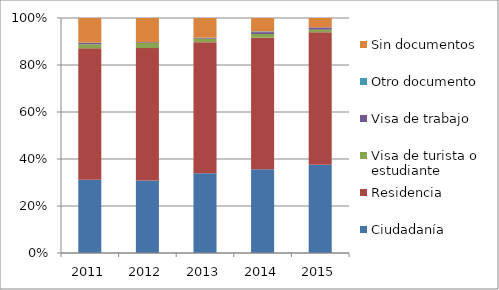
| Category | Ciudadanía | Residencia | Visa de turista o estudiante | Visa de trabajo | Otro documento | Sin documentos |
|---|---|---|---|---|---|---|
| 2011.0 | 31.1 | 55.9 | 1.7 | 0.6 | 0.1 | 10.5 |
| 2012.0 | 30.8 | 56.4 | 2.2 | 0.3 | 0 | 10.3 |
| 2013.0 | 33.9 | 55.8 | 1.5 | 0.3 | 0.1 | 8.4 |
| 2014.0 | 35.6 | 56 | 1.6 | 0.8 | 0.3 | 5.7 |
| 2015.0 | 37.5 | 56.3 | 1.1 | 1 | 0 | 4 |